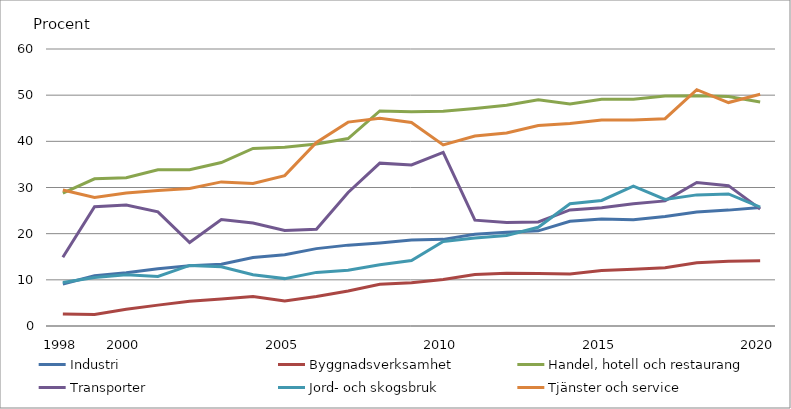
| Category | Industri | Byggnadsverksamhet | Handel, hotell och restaurang | Transporter | Jord- och skogsbruk | Tjänster och service |
|---|---|---|---|---|---|---|
| 1998.0 | 9.103 | 2.618 | 28.793 | 14.876 | 9.406 | 29.467 |
| nan | 10.882 | 2.478 | 31.88 | 25.833 | 10.526 | 27.829 |
| 2000.0 | 11.531 | 3.609 | 32.13 | 26.198 | 11.089 | 28.794 |
| nan | 12.394 | 4.523 | 33.826 | 24.722 | 10.737 | 29.328 |
| nan | 13.029 | 5.356 | 33.848 | 18.095 | 13.115 | 29.798 |
| nan | 13.39 | 5.838 | 35.41 | 23.055 | 12.81 | 31.215 |
| nan | 14.853 | 6.397 | 38.467 | 22.293 | 11.091 | 30.856 |
| 2005.0 | 15.439 | 5.423 | 38.708 | 20.676 | 10.265 | 32.577 |
| nan | 16.762 | 6.379 | 39.419 | 20.936 | 11.613 | 39.764 |
| nan | 17.517 | 7.566 | 40.608 | 28.923 | 12.057 | 44.161 |
| nan | 18 | 9.042 | 46.58 | 35.276 | 13.266 | 44.998 |
| nan | 18.602 | 9.388 | 46.407 | 34.877 | 14.196 | 44.085 |
| 2010.0 | 18.764 | 10.071 | 46.525 | 37.624 | 18.314 | 39.238 |
| nan | 19.88 | 11.141 | 47.126 | 22.929 | 19.073 | 41.139 |
| nan | 20.302 | 11.442 | 47.826 | 22.446 | 19.596 | 41.808 |
| nan | 20.607 | 11.355 | 48.986 | 22.544 | 21.39 | 43.422 |
| nan | 22.689 | 11.249 | 48.091 | 25.136 | 26.475 | 43.857 |
| 2015.0 | 23.2 | 12 | 49.1 | 25.6 | 27.2 | 44.6 |
| nan | 23 | 12.3 | 49.1 | 26.5 | 30.3 | 44.6 |
| nan | 23.7 | 12.6 | 49.8 | 27.1 | 27.4 | 44.9 |
| nan | 24.7 | 13.7 | 49.9 | 31.1 | 28.4 | 51.2 |
| nan | 25.1 | 14 | 49.7 | 30.4 | 28.6 | 48.4 |
| 2020.0 | 25.681 | 14.138 | 48.534 | 25.344 | 25.732 | 50.203 |